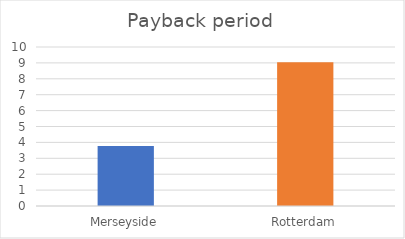
| Category | Series 0 |
|---|---|
| Merseyside | 3.77 |
| Rotterdam | 9.04 |